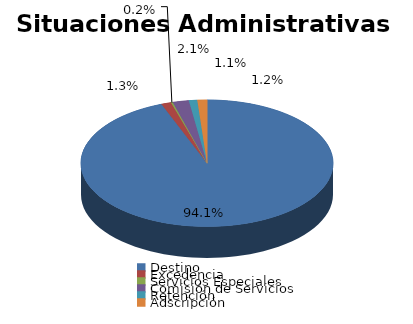
| Category | Series 0 |
|---|---|
| Destino | 2449 |
| Excedencia | 33 |
| Servicios Especiales | 6 |
| Comisión de Servicios | 54 |
| Retención | 28 |
| Adscripción | 32 |